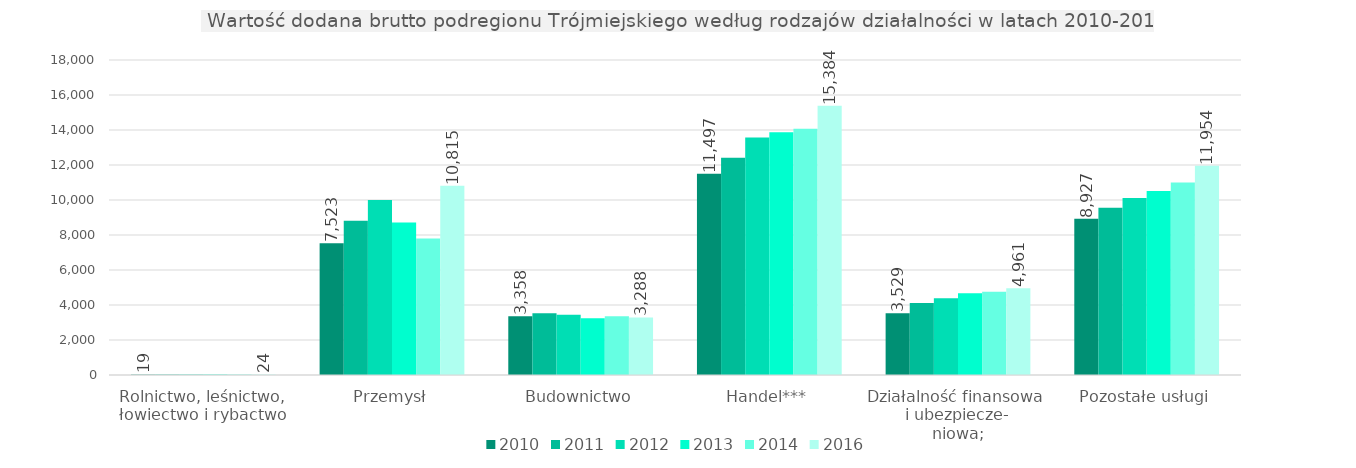
| Category | 2010 | 2011 | 2012 | 2013 | 2014 | 2016 |
|---|---|---|---|---|---|---|
| Rolnictwo, leśnictwo, łowiectwo i rybactwo | 19 | 22 | 23 | 24 | 25 | 24 |
| Przemysł | 7523 | 8813 | 10005 | 8710 | 7803 | 10815 |
| Budownictwo | 3358 | 3522 | 3437 | 3246 | 3351 | 3288 |
| Handel*** | 11497 | 12408 | 13568 | 13875 | 14068 | 15384 |
| Działalność finansowa 
i ubezpiecze-
niowa; | 3529 | 4109 | 4389 | 4667 | 4756 | 4961 |
| Pozostałe usługi | 8927 | 9555 | 10120 | 10516 | 11007 | 11954 |